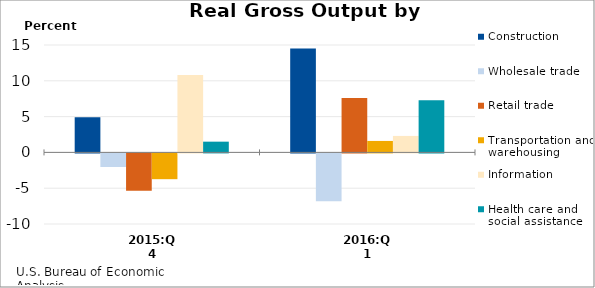
| Category | Construction | Wholesale trade | Retail trade | Transportation and warehousing | Information | Health care and social assistance |
|---|---|---|---|---|---|---|
| 2015:Q4 | 4.9 | -1.9 | -5.2 | -3.6 | 10.8 | 1.5 |
| 2016:Q1 | 14.5 | -6.7 | 7.6 | 1.6 | 2.3 | 7.3 |